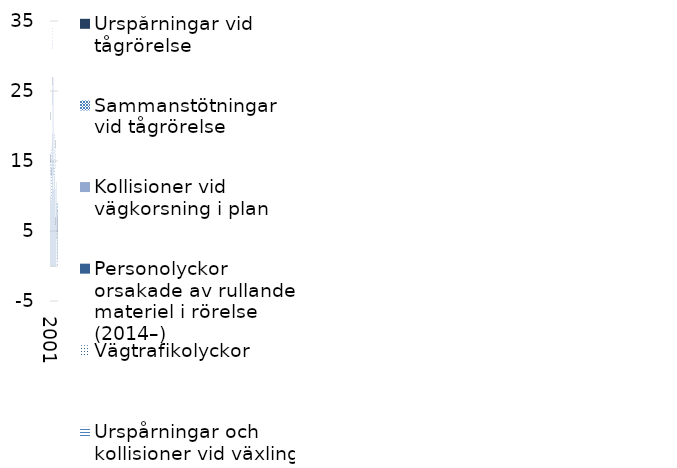
| Category | Andra olyckshändelser | Urspårningar och kollisioner vid växling  (2007–) | Vägtrafikolyckor | Personolyckor orsakade av rullande materiel i rörelse (2014–) | Kollisioner vid vägkorsning i plan | Sammanstötningar vid tågrörelse | Urspårningar vid tågrörelse  |
|---|---|---|---|---|---|---|---|
| 2001 | 16 | 0 | 5 | 0 | 0 | 0 | 1 |
| 2002 | 10 | 0 | 3 | 0 | 0 | 2 | 1 |
| 2003 | 10 | 0 | 3 | 0 | 0 | 4 | 0 |
| 2004 | 9 | 0 | 4 | 0 | 0 | 0 | 1 |
| 2005 | 19 | 0 | 4 | 0 | 3 | 0 | 1 |
| 2006 | 25 | 0 | 6 | 0 | 1 | 2 | 0 |
| 2007 | 27 | 0 | 3 | 0 | 0 | 0 | 0 |
| 2008 | 11 | 0 | 2 | 0 | 1 | 1 | 0 |
| 2009 | 13 | 0 | 3 | 0 | 0 | 3 | 0 |
| 2010 | 13 | 1 | 0 | 0 | 0 | 0 | 0 |
| 2011 | 11 | 0 | 3 | 0 | 2 | 1 | 1 |
| 2012 | 6 | 0 | 0 | 0 | 0 | 0 | 1 |
| 2013 | 4 | 0 | 0 | 0 | 0 | 0 | 0 |
| 2014 | 0 | 0 | 4 | 5 | 3 | 0 | 0 |
| 2015 | 0 | 0 | 5 | 3 | 0 | 1 | 0 |
| 2016 | 0 | 0 | 1 | 6 | 1 | 1 | 0 |